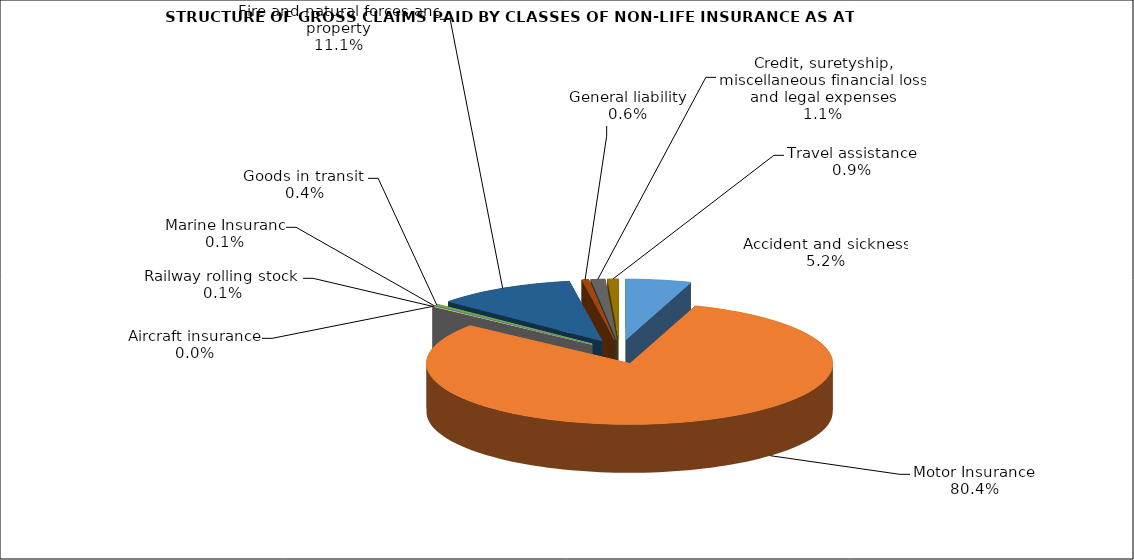
| Category | Accident and sickness | Series 1 |
|---|---|---|
| Accident and sickness | 0.052 |  |
| Motor Insurance | 0.804 |  |
| Railway rolling stock  | 0.001 |  |
| Aircraft insurance | 0 |  |
| Marine Insuranc | 0.001 |  |
| Goods in transit  | 0.004 |  |
| Fire and natural forces and property | 0.111 |  |
| General liability | 0.006 |  |
| Credit, suretyship, miscellaneous financial loss and legal expenses | 0.011 |  |
| Travel assistance | 0.009 |  |